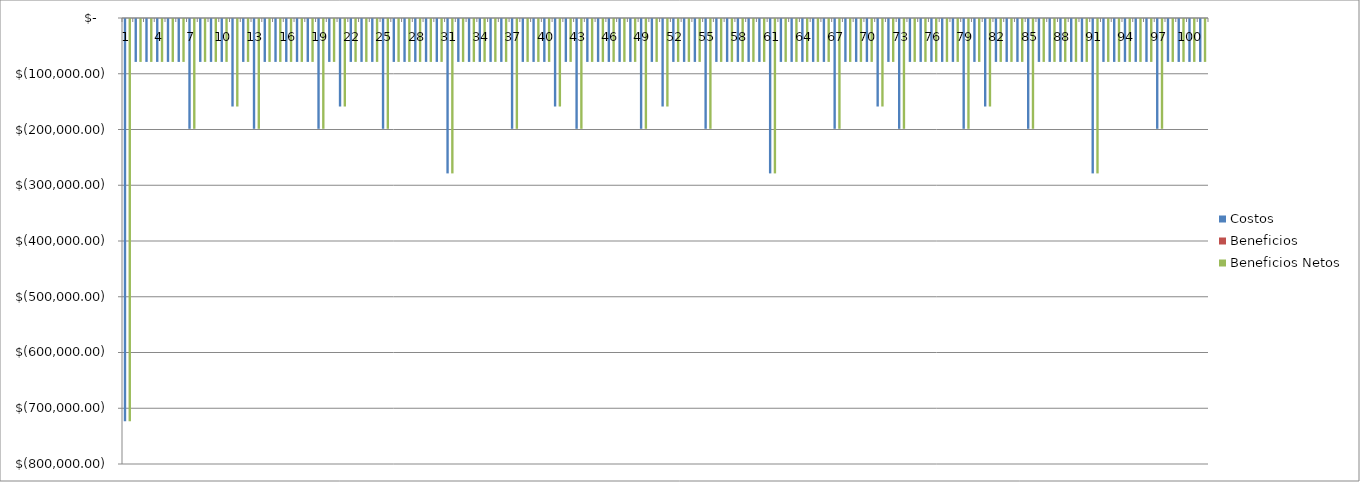
| Category |  Costos  |  Beneficios  |  Beneficios Netos  |
|---|---|---|---|
| 0 | -721405.246 | 0 | -721405.246 |
| 1 | -76964.185 | 0 | -76964.185 |
| 2 | -76964.185 | 0 | -76964.185 |
| 3 | -76964.185 | 0 | -76964.185 |
| 4 | -76964.185 | 0 | -76964.185 |
| 5 | -76964.185 | 0 | -76964.185 |
| 6 | -196964.185 | 0 | -196964.185 |
| 7 | -76964.185 | 0 | -76964.185 |
| 8 | -76964.185 | 0 | -76964.185 |
| 9 | -76964.185 | 0 | -76964.185 |
| 10 | -156964.185 | 0 | -156964.185 |
| 11 | -76964.185 | 0 | -76964.185 |
| 12 | -196964.185 | 0 | -196964.185 |
| 13 | -76964.185 | 0 | -76964.185 |
| 14 | -76964.185 | 0 | -76964.185 |
| 15 | -76964.185 | 0 | -76964.185 |
| 16 | -76964.185 | 0 | -76964.185 |
| 17 | -76964.185 | 0 | -76964.185 |
| 18 | -196964.185 | 0 | -196964.185 |
| 19 | -76964.185 | 0 | -76964.185 |
| 20 | -156964.185 | 0 | -156964.185 |
| 21 | -76964.185 | 0 | -76964.185 |
| 22 | -76964.185 | 0 | -76964.185 |
| 23 | -76964.185 | 0 | -76964.185 |
| 24 | -196964.185 | 0 | -196964.185 |
| 25 | -76964.185 | 0 | -76964.185 |
| 26 | -76964.185 | 0 | -76964.185 |
| 27 | -76964.185 | 0 | -76964.185 |
| 28 | -76964.185 | 0 | -76964.185 |
| 29 | -76964.185 | 0 | -76964.185 |
| 30 | -276964.185 | 0 | -276964.185 |
| 31 | -76964.185 | 0 | -76964.185 |
| 32 | -76964.185 | 0 | -76964.185 |
| 33 | -76964.185 | 0 | -76964.185 |
| 34 | -76964.185 | 0 | -76964.185 |
| 35 | -76964.185 | 0 | -76964.185 |
| 36 | -196964.185 | 0 | -196964.185 |
| 37 | -76964.185 | 0 | -76964.185 |
| 38 | -76964.185 | 0 | -76964.185 |
| 39 | -76964.185 | 0 | -76964.185 |
| 40 | -156964.185 | 0 | -156964.185 |
| 41 | -76964.185 | 0 | -76964.185 |
| 42 | -196964.185 | 0 | -196964.185 |
| 43 | -76964.185 | 0 | -76964.185 |
| 44 | -76964.185 | 0 | -76964.185 |
| 45 | -76964.185 | 0 | -76964.185 |
| 46 | -76964.185 | 0 | -76964.185 |
| 47 | -76964.185 | 0 | -76964.185 |
| 48 | -196964.185 | 0 | -196964.185 |
| 49 | -76964.185 | 0 | -76964.185 |
| 50 | -156964.185 | 0 | -156964.185 |
| 51 | -76964.185 | 0 | -76964.185 |
| 52 | -76964.185 | 0 | -76964.185 |
| 53 | -76964.185 | 0 | -76964.185 |
| 54 | -196964.185 | 0 | -196964.185 |
| 55 | -76964.185 | 0 | -76964.185 |
| 56 | -76964.185 | 0 | -76964.185 |
| 57 | -76964.185 | 0 | -76964.185 |
| 58 | -76964.185 | 0 | -76964.185 |
| 59 | -76964.185 | 0 | -76964.185 |
| 60 | -276964.185 | 0 | -276964.185 |
| 61 | -76964.185 | 0 | -76964.185 |
| 62 | -76964.185 | 0 | -76964.185 |
| 63 | -76964.185 | 0 | -76964.185 |
| 64 | -76964.185 | 0 | -76964.185 |
| 65 | -76964.185 | 0 | -76964.185 |
| 66 | -196964.185 | 0 | -196964.185 |
| 67 | -76964.185 | 0 | -76964.185 |
| 68 | -76964.185 | 0 | -76964.185 |
| 69 | -76964.185 | 0 | -76964.185 |
| 70 | -156964.185 | 0 | -156964.185 |
| 71 | -76964.185 | 0 | -76964.185 |
| 72 | -196964.185 | 0 | -196964.185 |
| 73 | -76964.185 | 0 | -76964.185 |
| 74 | -76964.185 | 0 | -76964.185 |
| 75 | -76964.185 | 0 | -76964.185 |
| 76 | -76964.185 | 0 | -76964.185 |
| 77 | -76964.185 | 0 | -76964.185 |
| 78 | -196964.185 | 0 | -196964.185 |
| 79 | -76964.185 | 0 | -76964.185 |
| 80 | -156964.185 | 0 | -156964.185 |
| 81 | -76964.185 | 0 | -76964.185 |
| 82 | -76964.185 | 0 | -76964.185 |
| 83 | -76964.185 | 0 | -76964.185 |
| 84 | -196964.185 | 0 | -196964.185 |
| 85 | -76964.185 | 0 | -76964.185 |
| 86 | -76964.185 | 0 | -76964.185 |
| 87 | -76964.185 | 0 | -76964.185 |
| 88 | -76964.185 | 0 | -76964.185 |
| 89 | -76964.185 | 0 | -76964.185 |
| 90 | -276964.185 | 0 | -276964.185 |
| 91 | -76964.185 | 0 | -76964.185 |
| 92 | -76964.185 | 0 | -76964.185 |
| 93 | -76964.185 | 0 | -76964.185 |
| 94 | -76964.185 | 0 | -76964.185 |
| 95 | -76964.185 | 0 | -76964.185 |
| 96 | -196964.185 | 0 | -196964.185 |
| 97 | -76964.185 | 0 | -76964.185 |
| 98 | -76964.185 | 0 | -76964.185 |
| 99 | -76964.185 | 0 | -76964.185 |
| 100 | -76964.185 | 0 | -76964.185 |